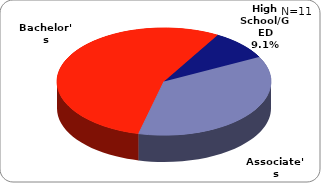
| Category | Series 0 |
|---|---|
| High School/GED | 0.091 |
| Associate's | 0.364 |
| Bachelor's | 0.545 |